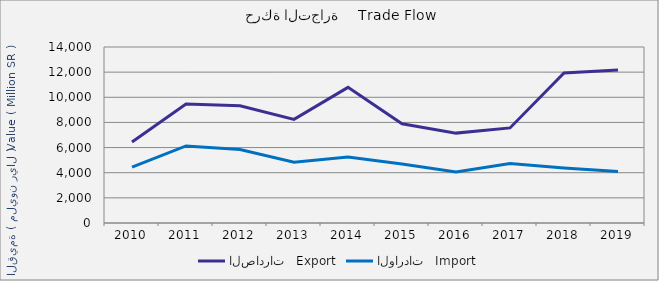
| Category | الصادرات   Export | الواردات   Import |
|---|---|---|
| 2010.0 | 6444199354 | 4438735512 |
| 2011.0 | 9471038730 | 6128900177 |
| 2012.0 | 9328455169 | 5840097503 |
| 2013.0 | 8243151442 | 4833506219 |
| 2014.0 | 10788855255 | 5249590966 |
| 2015.0 | 7894132245 | 4694438323 |
| 2016.0 | 7149925037 | 4051682175 |
| 2017.0 | 7562657392 | 4733206457 |
| 2018.0 | 11937492882 | 4381625857 |
| 2019.0 | 12176049036 | 4105718478 |